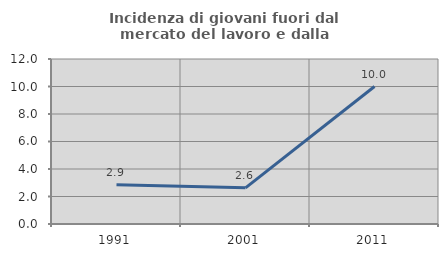
| Category | Incidenza di giovani fuori dal mercato del lavoro e dalla formazione  |
|---|---|
| 1991.0 | 2.857 |
| 2001.0 | 2.632 |
| 2011.0 | 10 |